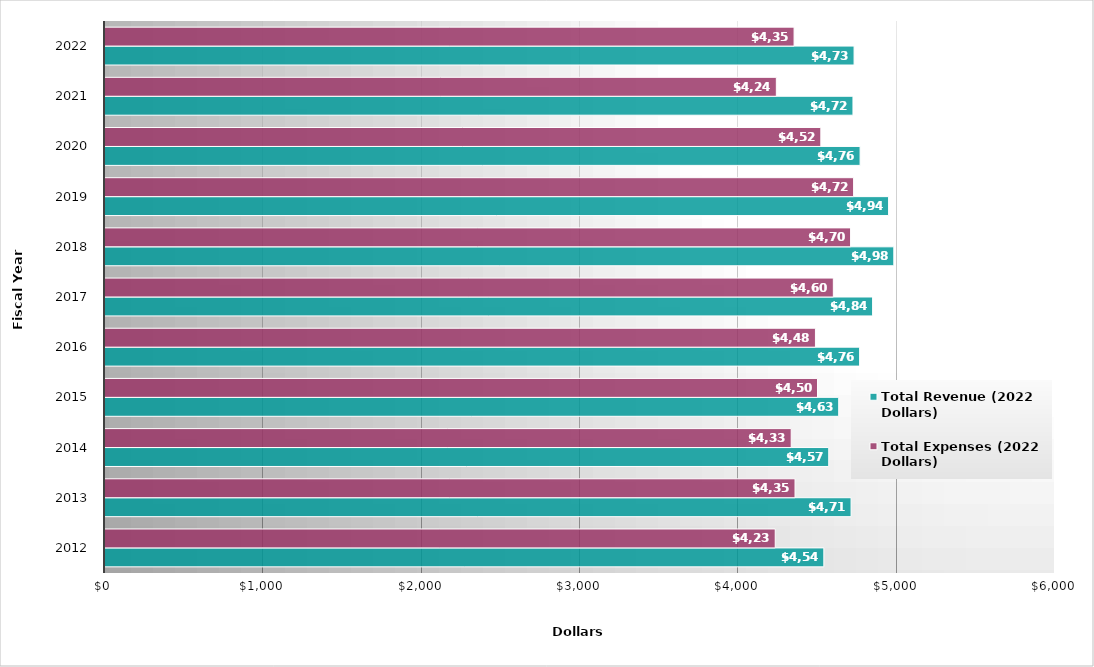
| Category | Total Revenue (2022 Dollars) | Total Expenses (2022 Dollars) |
|---|---|---|
| 2012.0 | 4540 | 4233 |
| 2013.0 | 4712 | 4358 |
| 2014.0 | 4571 | 4334 |
| 2015.0 | 4634 | 4500 |
| 2016.0 | 4766 | 4487 |
| 2017.0 | 4848 | 4600 |
| 2018.0 | 4982 | 4709 |
| 2019.0 | 4949 | 4728 |
| 2020.0 | 4769 | 4521 |
| 2021.0 | 4724 | 4240 |
| 2022.0 | 4731 | 4352 |